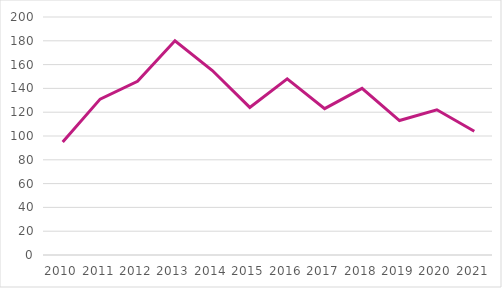
| Category | Antal prioritetsskabende patentansøgninger på universiteterne  |
|---|---|
| 2010.0 | 95 |
| 2011.0 | 131 |
| 2012.0 | 146 |
| 2013.0 | 180 |
| 2014.0 | 155 |
| 2015.0 | 124 |
| 2016.0 | 148 |
| 2017.0 | 123 |
| 2018.0 | 140 |
| 2019.0 | 113 |
| 2020.0 | 122 |
| 2021.0 | 104 |